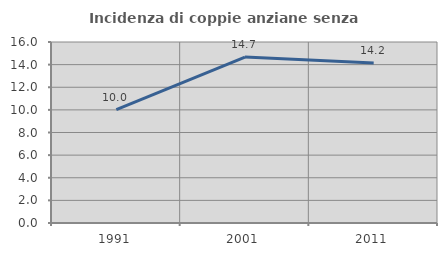
| Category | Incidenza di coppie anziane senza figli  |
|---|---|
| 1991.0 | 10.019 |
| 2001.0 | 14.669 |
| 2011.0 | 14.155 |